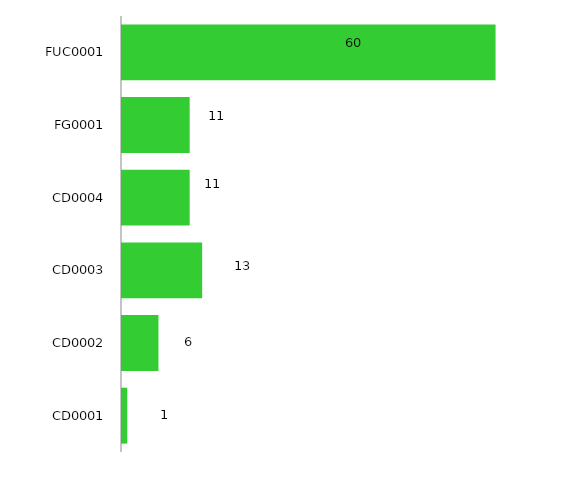
| Category | 2017 |
|---|---|
| CD0001 | 1 |
| CD0002 | 6 |
| CD0003 | 13 |
| CD0004 | 11 |
| FG0001 | 11 |
| FUC0001 | 60 |